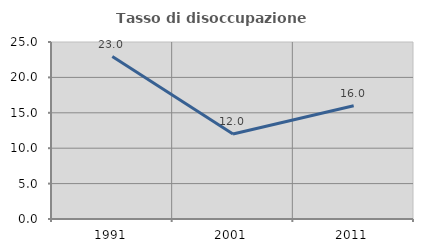
| Category | Tasso di disoccupazione giovanile  |
|---|---|
| 1991.0 | 22.951 |
| 2001.0 | 12 |
| 2011.0 | 16 |